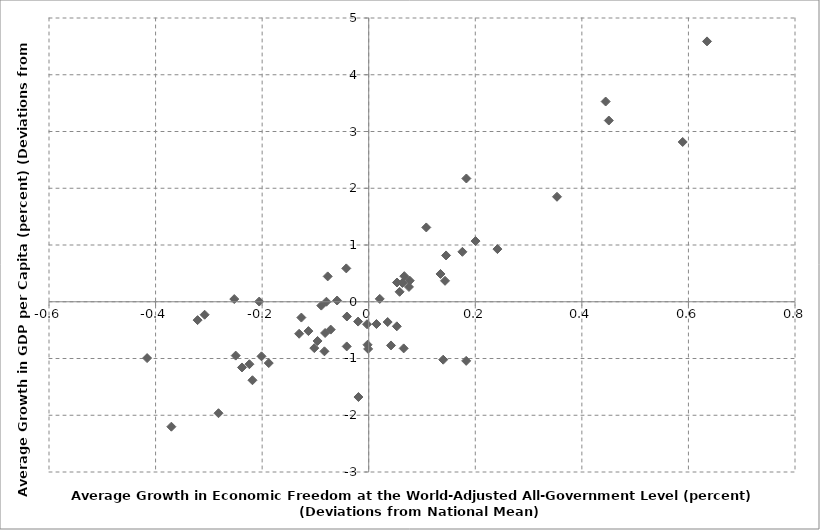
| Category | Series 0 |
|---|---|
| 0.07551087391766739 | 0.261 |
| 0.1828861886617133 | -1.042 |
| -0.10210121979564121 | -0.817 |
| -0.12638348488091547 | -0.279 |
| 0.6348909743858446 | 4.588 |
| -0.41588202601744556 | -0.993 |
| -0.3703620657799513 | -2.202 |
| -0.24963074175827185 | -0.949 |
| -0.21816119011655696 | -1.383 |
| 0.5892326913835566 | 2.815 |
| -0.059324937074522674 | 0.022 |
| 0.35332284372452283 | 1.85 |
| -0.1875901362094071 | -1.08 |
| -0.20550691856219133 | 0.003 |
| 0.04183983491201134 | -0.77 |
| -0.0010651811635920341 | -0.831 |
| -0.002226589516456795 | -0.758 |
| -0.0031879649798751547 | -0.396 |
| -0.04125122322702311 | -0.787 |
| -0.019232365358425214 | -1.679 |
| -0.0769762100040294 | 0.447 |
| 0.06562951840036156 | -0.822 |
| 0.014535814440270328 | -0.393 |
| -0.08183405736615842 | -0.55 |
| 0.1347144259386035 | 0.489 |
| 0.05303855221344654 | 0.339 |
| -0.3211167897610721 | -0.324 |
| 0.18326813545583107 | 2.172 |
| -0.04092091278711952 | -0.26 |
| -0.042072874211019316 | 0.588 |
| -0.01994092398968604 | -0.349 |
| -0.2818998530316294 | -1.964 |
| 0.03556955184801126 | -0.358 |
| -0.07933022325618683 | 0.001 |
| -0.2011572715643761 | -0.962 |
| 0.10803699508589899 | 1.309 |
| 0.1758022099441864 | 0.88 |
| 0.13978801980807226 | -1.021 |
| -0.07131473673488639 | -0.491 |
| -0.11317576443810579 | -0.517 |
| -0.3079348104412596 | -0.229 |
| 0.07699899289620761 | 0.371 |
| -0.08310331575405554 | -0.874 |
| 0.4446831692576365 | 3.528 |
| -0.2238994907556484 | -1.101 |
| 0.24155916221487822 | 0.928 |
| 0.06677247862132157 | 0.451 |
| -0.08896133504827983 | -0.068 |
| 0.06331214667843285 | 0.331 |
| -0.23781810467933695 | -1.158 |
| 0.20045312150990918 | 1.069 |
| -0.09600515393298187 | -0.691 |
| 0.14323951193806803 | 0.369 |
| 0.020721756158547343 | 0.051 |
| -0.2523024571399326 | 0.048 |
| 0.05798466621526593 | 0.175 |
| 0.05273606334399248 | -0.433 |
| 0.14514149899069878 | 0.816 |
| -0.130556988762082 | -0.564 |
| 0.45055812015314556 | 3.193 |